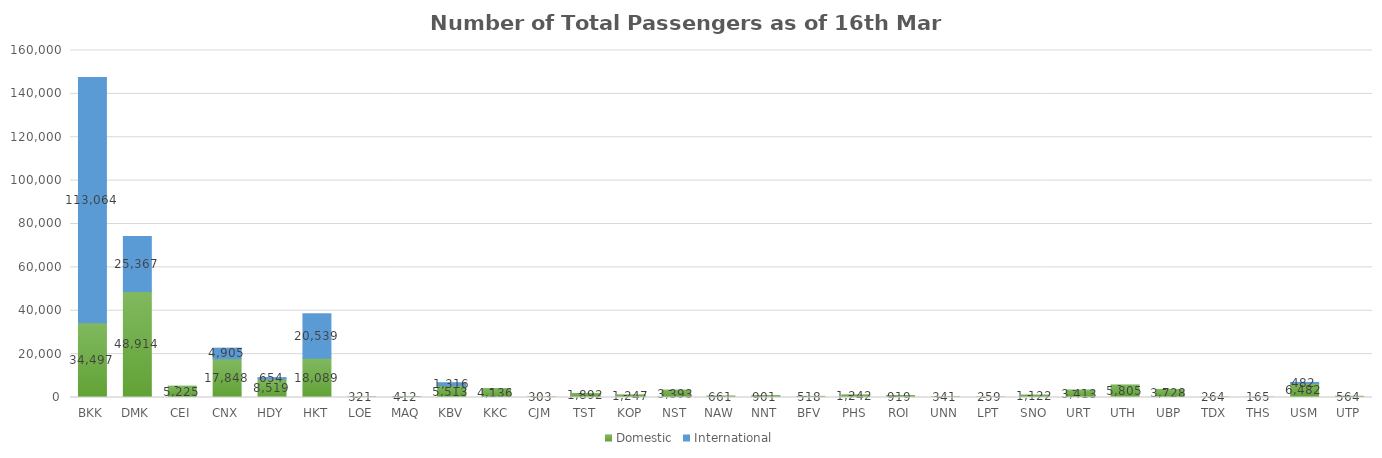
| Category | Domestic | International |
|---|---|---|
| BKK | 34497 | 113064 |
| DMK | 48914 | 25367 |
| CEI | 5225 | 0 |
| CNX | 17848 | 4905 |
| HDY | 8519 | 654 |
| HKT | 18089 | 20539 |
| LOE | 321 | 0 |
| MAQ | 412 | 0 |
| KBV | 5513 | 1316 |
| KKC | 4136 | 0 |
| CJM | 303 | 0 |
| TST | 1892 | 0 |
| KOP | 1247 | 0 |
| NST | 3393 | 0 |
| NAW | 661 | 0 |
| NNT | 901 | 0 |
| BFV | 518 | 0 |
| PHS | 1242 | 0 |
| ROI | 919 | 0 |
| UNN | 341 | 0 |
| LPT | 259 | 0 |
| SNO | 1122 | 0 |
| URT | 3413 | 0 |
| UTH | 5805 | 0 |
| UBP | 3728 | 0 |
| TDX | 264 | 0 |
| THS | 165 | 0 |
| USM | 6482 | 482 |
| UTP | 564 | 0 |